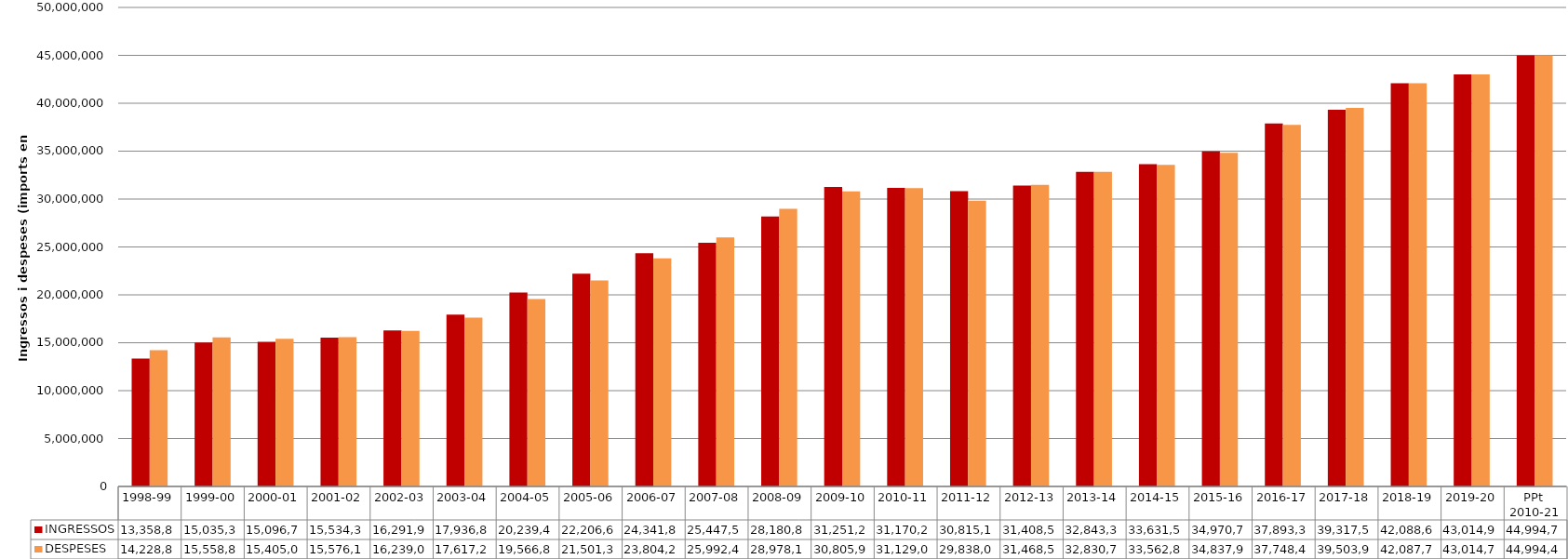
| Category | INGRESSOS | DESPESES |
|---|---|---|
| 1998-99 | 13358885.213 | 14228884.741 |
| 1999-00 | 15035371.651 | 15558895.736 |
| 2000-01 | 15096739.773 | 15405022.129 |
| 2001-02 | 15534312.45 | 15576122.73 |
| 2002-03 | 16291934.64 | 16239048.47 |
| 2003-04 | 17936804.62 | 17617212.91 |
| 2004-05 | 20239462.67 | 19566820.32 |
| 2005-06 | 22206612.01 | 21501391.79 |
| 2006-07 | 24341859 | 23804238 |
| 2007-08 | 25447527 | 25992420 |
| 2008-09 | 28180863 | 28978125 |
| 2009-10 | 31251243 | 30805920 |
| 2010-11 | 31170274.1 | 31129053.13 |
| 2011-12 | 30815189.63 | 29838016.5 |
| 2012-13 | 31408511.95 | 31468540.28 |
| 2013-14 | 32843306.36 | 32830795.66 |
| 2014-15 | 33631594 | 33562866 |
| 2015-16 | 34970720 | 34837955 |
| 2016-17 | 37893313 | 37748473 |
| 2017-18 | 39317506 | 39503919 |
| 2018-19 | 42088626 | 42087710 |
| 2019-20 | 43014979.6 | 43014781.36 |
| PPt 
2010-21 | 44994793 | 44994400 |